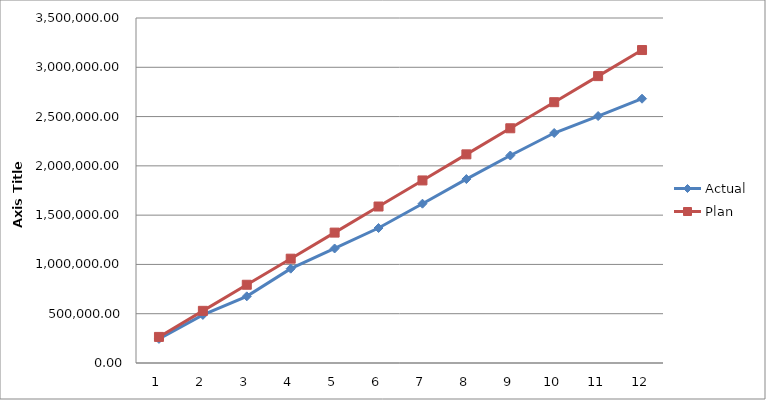
| Category | Actual | Plan |
|---|---|---|
| 0 | 244369.04 | 264583.333 |
| 1 | 487948.56 | 529166.667 |
| 2 | 676367.65 | 793750 |
| 3 | 956886.88 | 1058333.333 |
| 4 | 1161719.22 | 1322916.667 |
| 5 | 1369452.09 | 1587500 |
| 6 | 1616060.3 | 1852083.333 |
| 7 | 1865754.88 | 2116666.667 |
| 8 | 2104792.89 | 2381250 |
| 9 | 2333346.86 | 2645833.333 |
| 10 | 2505236.8 | 2910416.667 |
| 11 | 2681222.73 | 3175000 |